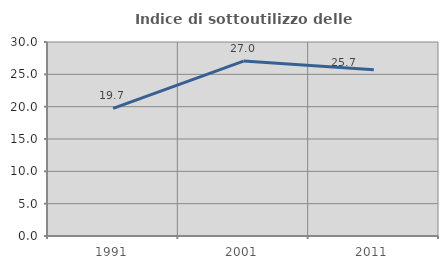
| Category | Indice di sottoutilizzo delle abitazioni  |
|---|---|
| 1991.0 | 19.747 |
| 2001.0 | 27.048 |
| 2011.0 | 25.714 |